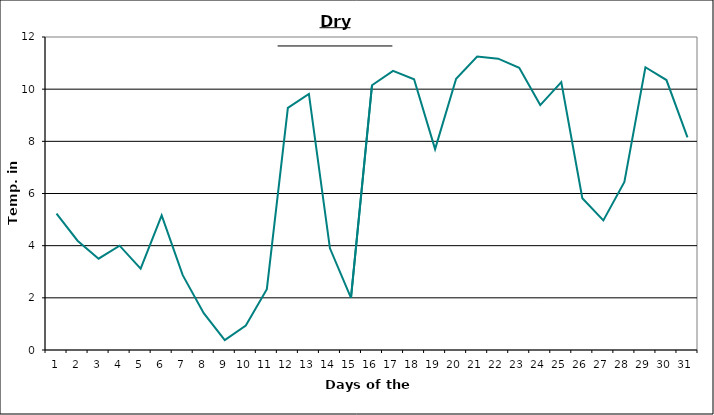
| Category | Series 0 |
|---|---|
| 0 | 5.23 |
| 1 | 4.19 |
| 2 | 3.5 |
| 3 | 4 |
| 4 | 3.12 |
| 5 | 5.16 |
| 6 | 2.87 |
| 7 | 1.41 |
| 8 | 0.38 |
| 9 | 0.94 |
| 10 | 2.33 |
| 11 | 9.28 |
| 12 | 9.82 |
| 13 | 3.9 |
| 14 | 2 |
| 15 | 10.15 |
| 16 | 10.7 |
| 17 | 10.38 |
| 18 | 7.7 |
| 19 | 10.4 |
| 20 | 11.25 |
| 21 | 11.17 |
| 22 | 10.82 |
| 23 | 9.39 |
| 24 | 10.27 |
| 25 | 5.82 |
| 26 | 4.97 |
| 27 | 6.44 |
| 28 | 10.84 |
| 29 | 10.35 |
| 30 | 8.15 |